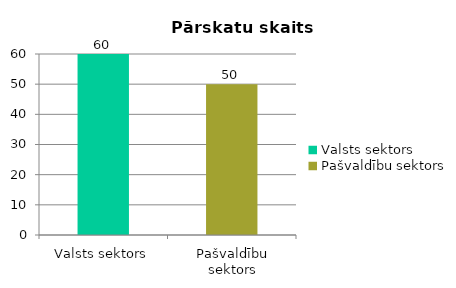
| Category |  Pārskatu skaits |
|---|---|
| Valsts sektors | 60 |
| Pašvaldību sektors | 50 |